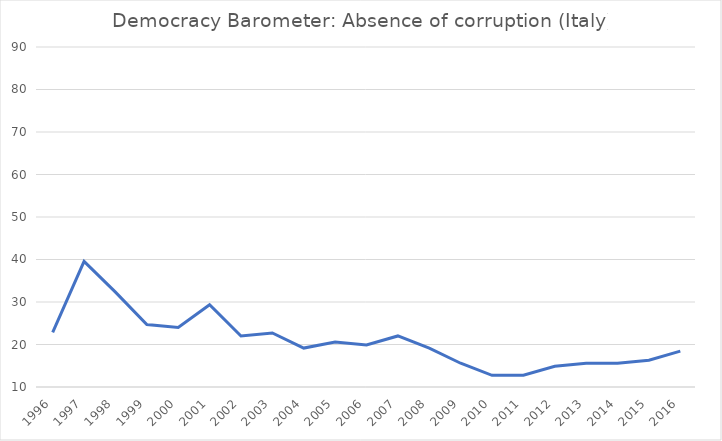
| Category | TR_NOSEC2 |
|---|---|
| 1996.0 | 22.859 |
| 1997.0 | 39.551 |
| 1998.0 | 32.317 |
| 1999.0 | 24.697 |
| 2000.0 | 23.984 |
| 2001.0 | 29.361 |
| 2002.0 | 22.013 |
| 2003.0 | 22.726 |
| 2004.0 | 19.16 |
| 2005.0 | 20.587 |
| 2006.0 | 19.873 |
| 2007.0 | 22.013 |
| 2008.0 | 19.16 |
| 2009.0 | 15.594 |
| 2010.0 | 12.741 |
| 2011.0 | 12.79 |
| 2012.0 | 14.881 |
| 2013.0 | 15.594 |
| 2014.0 | 15.594 |
| 2015.0 | 16.307 |
| 2016.0 | 18.447 |